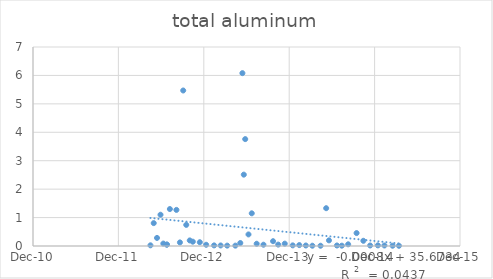
| Category | Series 0 |
|---|---|
| 41017.0 | 0.024 |
| 41031.0 | 0.805 |
| 41045.0 | 0.284 |
| 41060.0 | 1.1 |
| 41072.0 | 0.085 |
| 41087.0 | 0.046 |
| 41087.0 | 0.052 |
| 41100.0 | 1.3 |
| 41128.0 | 1.27 |
| 41143.0 | 0.126 |
| 41157.0 | 5.47 |
| 41170.0 | 0.743 |
| 41185.0 | 0.196 |
| 41198.0 | 0.152 |
| 41228.0 | 0.133 |
| 41255.0 | 0.043 |
| 41289.0 | 0.021 |
| 41317.0 | 0.019 |
| 41345.0 | 0.013 |
| 41380.0 | 0.013 |
| 41401.0 | 0.105 |
| 41410.0 | 6.08 |
| 41416.0 | 2.51 |
| 41422.0 | 3.76 |
| 41436.0 | 0.407 |
| 41450.0 | 1.15 |
| 41471.0 | 0.079 |
| 41500.0 | 0.045 |
| 41541.0 | 0.169 |
| 41563.0 | 0.049 |
| 41591.0 | 0.082 |
| 41625.0 | 0.022 |
| 41653.0 | 0.032 |
| 41681.0 | 0.018 |
| 41709.0 | 0.01 |
| 41744.0 | 0.009 |
| 41768.0 | 1.33 |
| 41780.0 | 0.198 |
| 41814.0 | 0.018 |
| 41835.0 | 0.011 |
| 41862.0 | 0.06 |
| 41898.0 | 0.455 |
| 41927.0 | 0.183 |
| 41956.0 | 0.018 |
| 41989.0 | 0.022 |
| 42017.0 | 0.018 |
| 42052.0 | 0.01 |
| 42079.0 | 0.008 |